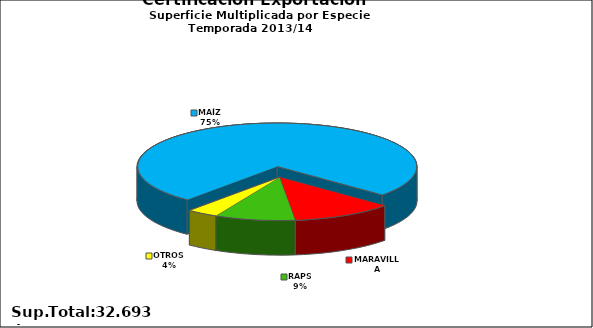
| Category | Series 0 |
|---|---|
| MAÍZ | 24631 |
| MARAVILLA | 3845 |
| RAPS | 3035 |
| OTROS | 1182 |